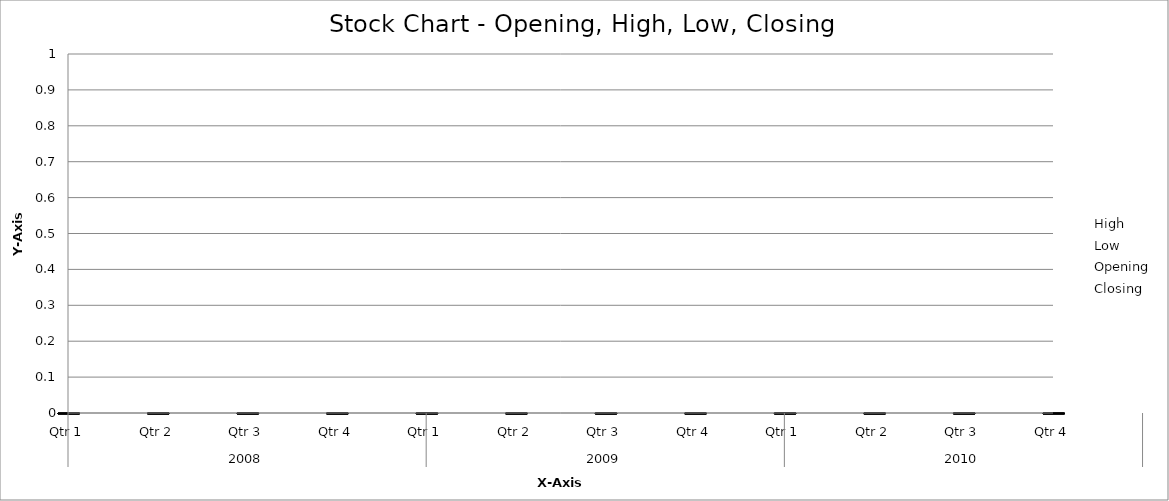
| Category | High | Low | Opening | Closing |
|---|---|---|---|---|
| 0 | 204 | 109 | 130 | 132 |
| 1 | 197 | 85 | 132 | 125 |
| 2 | 186 | 87 | 125 | 141 |
| 3 | 177 | 108 | 141 | 156 |
| 4 | 211 | 134 | 156 | 148 |
| 5 | 195 | 124 | 148 | 182 |
| 6 | 223 | 146 | 182 | 170 |
| 7 | 275 | 130 | 170 | 173 |
| 8 | 279 | 127 | 173 | 163 |
| 9 | 271 | 131 | 163 | 271 |
| 10 | 310 | 249 | 271 | 276 |
| 11 | 305 | 241 | 276 | 245 |